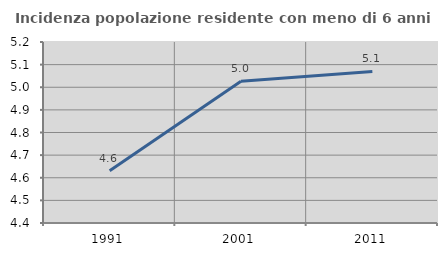
| Category | Incidenza popolazione residente con meno di 6 anni |
|---|---|
| 1991.0 | 4.631 |
| 2001.0 | 5.027 |
| 2011.0 | 5.07 |